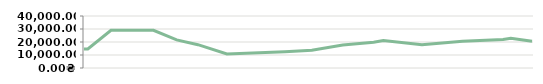
| Category | КВАРТАЛ   |
|---|---|
| 2013-04-23 | 14600 |
| 2013-04-25 | 14600 |
| 2013-05-07 | 29000 |
| 2013-05-14 | 29000 |
| 2013-05-14 | 29000 |
| 2013-05-29 | 29000 |
| 2013-06-10 | 21600 |
| 2013-06-21 | 17950 |
| 2013-07-06 | 10776.471 |
| 2013-08-05 | 12455.862 |
| 2013-08-19 | 13667.568 |
| 2013-09-04 | 17651.667 |
| 2013-09-20 | 19877.912 |
| 2013-09-25 | 21138.05 |
| 2013-10-15 | 17951.744 |
| 2013-11-05 | 20556.13 |
| 2013-11-26 | 21997.139 |
| 2013-11-30 | 22917.635 |
| 2013-12-11 | 20504.315 |